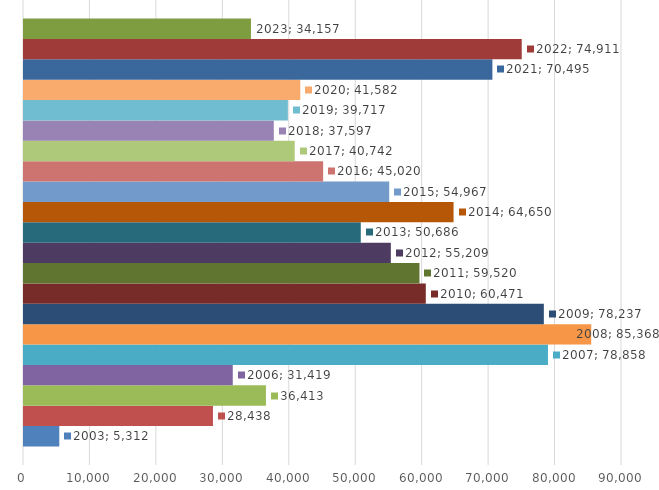
| Category | 2003 | 2004 | 2005 | 2006 | 2007 | 2008 | 2009 | 2010 | 2011 | 2012 | 2013 | 2014 | 2015 | 2016 | 2017 | 2018 | 2019 | 2020 | 2021 | 2022 | 2023 |
|---|---|---|---|---|---|---|---|---|---|---|---|---|---|---|---|---|---|---|---|---|---|
| 0 | 5312 | 28438 | 36413 | 31419 | 78858 | 85368 | 78237 | 60471 | 59520 | 55209 | 50686 | 64650 | 54967 | 45020 | 40742 | 37597 | 39717 | 41582 | 70495 | 74911 | 34157 |